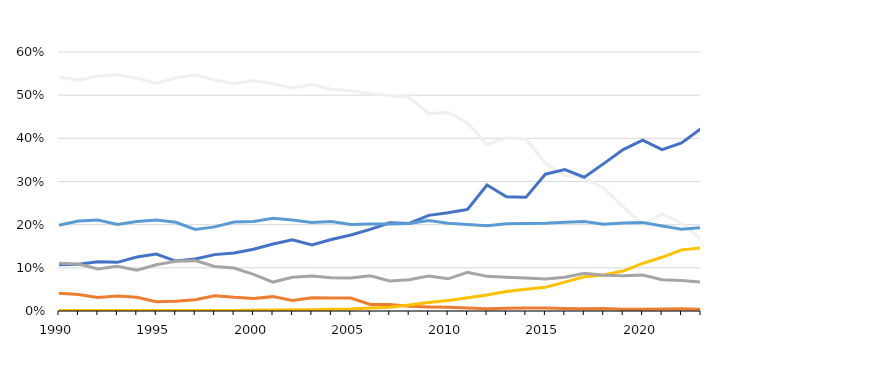
| Category | coal-fired generation | natural gas-fired generation | petroleum-fired generation | wind and solar | nuclear | other renewables |
|---|---|---|---|---|---|---|
| 1990 | 0.542 | 0.107 | 0.041 | 0.001 | 0.199 | 0.11 |
| 1991 | 0.534 | 0.108 | 0.038 | 0.001 | 0.209 | 0.109 |
| 1992 | 0.544 | 0.114 | 0.031 | 0.001 | 0.211 | 0.098 |
| 1993 | 0.547 | 0.113 | 0.035 | 0.001 | 0.2 | 0.104 |
| 1994 | 0.539 | 0.125 | 0.032 | 0.001 | 0.207 | 0.095 |
| 1995 | 0.528 | 0.132 | 0.021 | 0.001 | 0.211 | 0.107 |
| 1996 | 0.54 | 0.116 | 0.023 | 0.001 | 0.205 | 0.115 |
| 1997 | 0.547 | 0.12 | 0.026 | 0.001 | 0.189 | 0.117 |
| 1998 | 0.535 | 0.131 | 0.035 | 0.001 | 0.195 | 0.103 |
| 1999 | 0.527 | 0.134 | 0.032 | 0.001 | 0.206 | 0.1 |
| 2000 | 0.534 | 0.143 | 0.029 | 0.002 | 0.207 | 0.085 |
| 2001 | 0.526 | 0.155 | 0.033 | 0.002 | 0.215 | 0.067 |
| 2002 | 0.517 | 0.165 | 0.024 | 0.003 | 0.211 | 0.078 |
| 2003 | 0.525 | 0.153 | 0.031 | 0.003 | 0.205 | 0.081 |
| 2004 | 0.514 | 0.166 | 0.03 | 0.004 | 0.207 | 0.077 |
| 2005 | 0.51 | 0.176 | 0.03 | 0.005 | 0.2 | 0.077 |
| 2006 | 0.504 | 0.189 | 0.015 | 0.007 | 0.201 | 0.082 |
| 2007 | 0.499 | 0.204 | 0.015 | 0.009 | 0.201 | 0.07 |
| 2008 | 0.495 | 0.203 | 0.011 | 0.014 | 0.203 | 0.072 |
| 2009 | 0.457 | 0.222 | 0.009 | 0.02 | 0.21 | 0.081 |
| 2010 | 0.46 | 0.228 | 0.009 | 0.024 | 0.203 | 0.075 |
| 2011 | 0.435 | 0.235 | 0.007 | 0.031 | 0.2 | 0.089 |
| 2012 | 0.386 | 0.292 | 0.005 | 0.037 | 0.198 | 0.08 |
| 2013 | 0.402 | 0.265 | 0.006 | 0.045 | 0.202 | 0.078 |
| 2014 | 0.398 | 0.263 | 0.007 | 0.05 | 0.202 | 0.076 |
| 2015 | 0.342 | 0.317 | 0.007 | 0.055 | 0.203 | 0.074 |
| 2016 | 0.314 | 0.328 | 0.006 | 0.067 | 0.206 | 0.078 |
| 2017 | 0.309 | 0.31 | 0.005 | 0.079 | 0.208 | 0.088 |
| 2018 | 0.284 | 0.341 | 0.006 | 0.083 | 0.201 | 0.083 |
| 2019 | 0.242 | 0.374 | 0.004 | 0.092 | 0.204 | 0.082 |
| 2020 | 0.199 | 0.396 | 0.004 | 0.11 | 0.205 | 0.083 |
| 2021 | 0.226 | 0.374 | 0.005 | 0.124 | 0.197 | 0.073 |
| 2022 | 0.203 | 0.389 | 0.005 | 0.142 | 0.189 | 0.071 |
| 2023 | 0.167 | 0.422 | 0.004 | 0.146 | 0.193 | 0.067 |